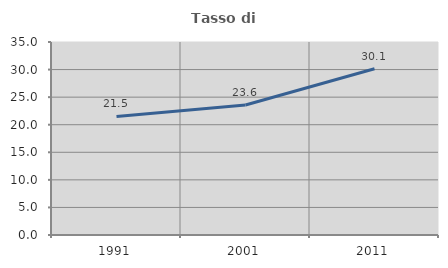
| Category | Tasso di occupazione   |
|---|---|
| 1991.0 | 21.505 |
| 2001.0 | 23.579 |
| 2011.0 | 30.15 |